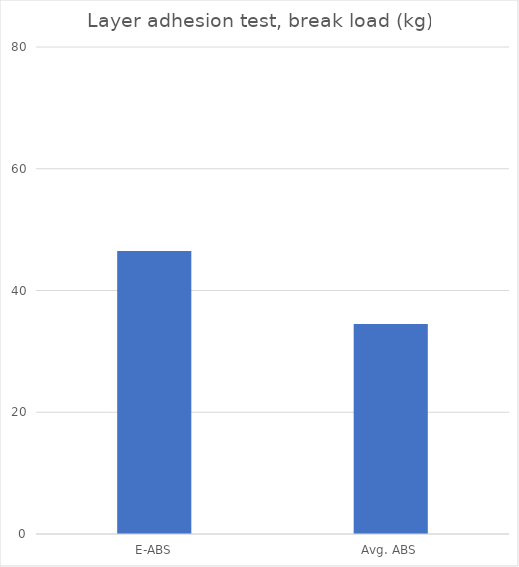
| Category | Average |
|---|---|
| E-ABS | 46.5 |
| Avg. ABS | 34.5 |